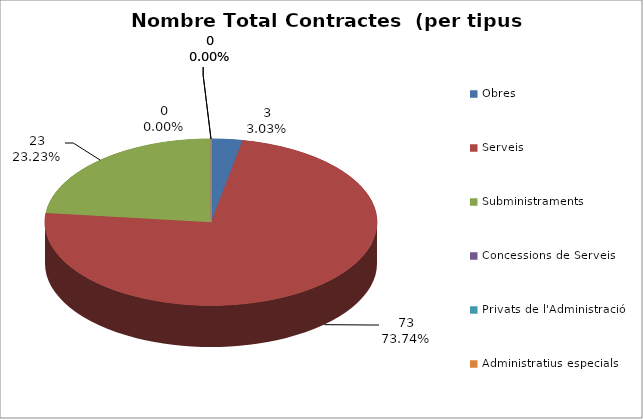
| Category | Nombre Total Contractes |
|---|---|
| Obres | 3 |
| Serveis | 73 |
| Subministraments | 23 |
| Concessions de Serveis | 0 |
| Privats de l'Administració | 0 |
| Administratius especials | 0 |